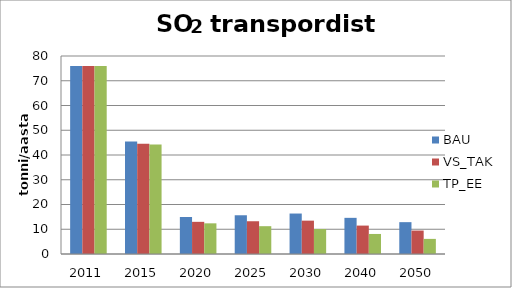
| Category | BAU | VS_TAK | TP_EE |
|---|---|---|---|
| 2011.0 | 76 | 76 | 76 |
| 2015.0 | 45.474 | 44.497 | 44.196 |
| 2020.0 | 14.949 | 12.995 | 12.392 |
| 2025.0 | 15.65 | 13.236 | 11.239 |
| 2030.0 | 16.352 | 13.477 | 10.086 |
| 2040.0 | 14.609 | 11.478 | 8.095 |
| 2050.0 | 12.866 | 9.48 | 6.105 |